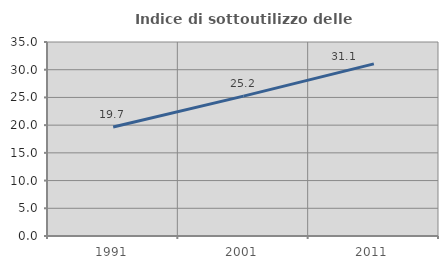
| Category | Indice di sottoutilizzo delle abitazioni  |
|---|---|
| 1991.0 | 19.656 |
| 2001.0 | 25.242 |
| 2011.0 | 31.055 |